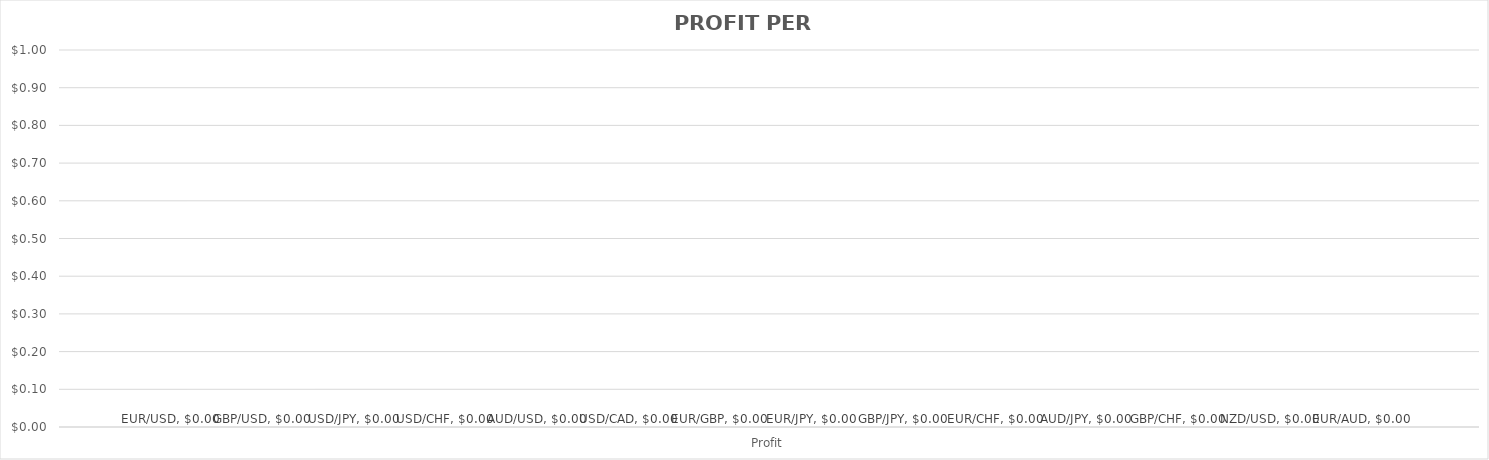
| Category | EUR/USD | GBP/USD | USD/JPY | USD/CHF | AUD/USD | USD/CAD | EUR/GBP | EUR/JPY | GBP/JPY | EUR/CHF | AUD/JPY | GBP/CHF | NZD/USD | EUR/AUD |
|---|---|---|---|---|---|---|---|---|---|---|---|---|---|---|
| Profit | 0 | 0 | 0 | 0 | 0 | 0 | 0 | 0 | 0 | 0 | 0 | 0 | 0 | 0 |